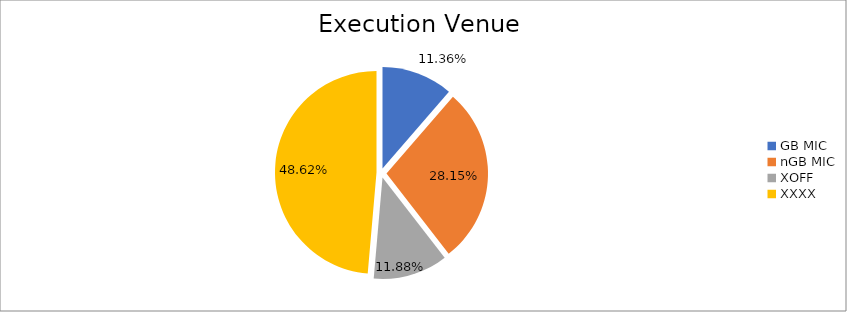
| Category | Series 0 |
|---|---|
| GB MIC | 1220917.783 |
| nGB MIC | 3025098.001 |
| XOFF | 1276544.475 |
| XXXX | 5225698.142 |